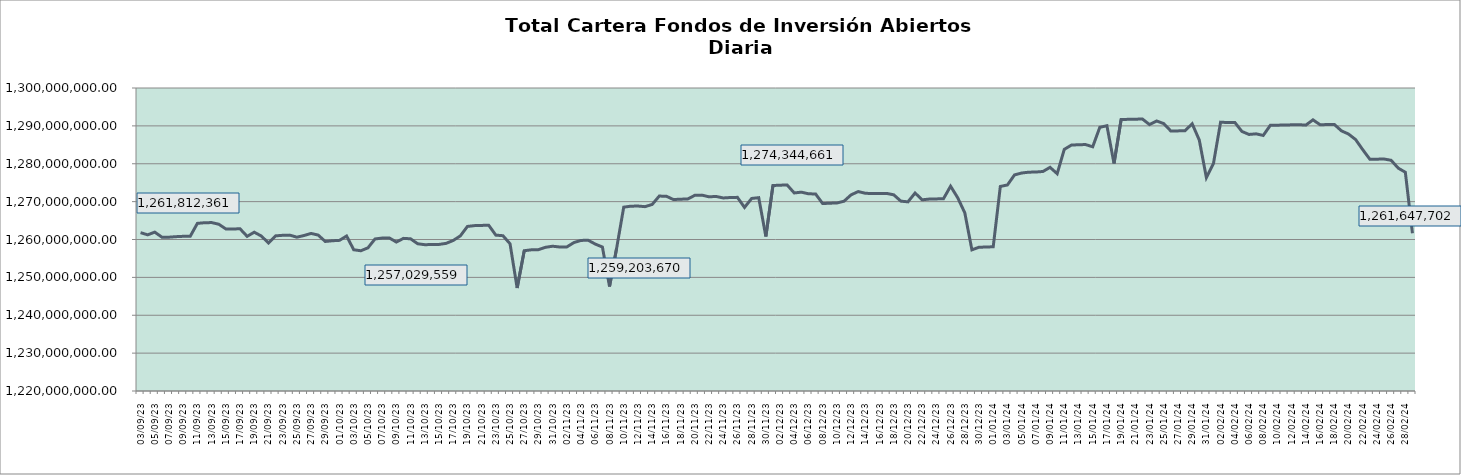
| Category | Cartera |
|---|---|
| 2023-09-03 | 1261812361.078 |
| 2023-09-04 | 1261232176.304 |
| 2023-09-05 | 1261946632.71 |
| 2023-09-06 | 1260620047.07 |
| 2023-09-07 | 1260610290.071 |
| 2023-09-08 | 1260750120.456 |
| 2023-09-09 | 1260838059.302 |
| 2023-09-10 | 1260877946.25 |
| 2023-09-11 | 1264256565.222 |
| 2023-09-12 | 1264427746.041 |
| 2023-09-13 | 1264467143.886 |
| 2023-09-14 | 1264039135.928 |
| 2023-09-15 | 1262791515.257 |
| 2023-09-16 | 1262783481.827 |
| 2023-09-17 | 1262825677.316 |
| 2023-09-18 | 1260833700.144 |
| 2023-09-19 | 1261927649.388 |
| 2023-09-20 | 1260912715.638 |
| 2023-09-21 | 1259080878.318 |
| 2023-09-22 | 1260963147.981 |
| 2023-09-23 | 1261107724.507 |
| 2023-09-24 | 1261155641.447 |
| 2023-09-25 | 1260608471.59 |
| 2023-09-26 | 1261051471.734 |
| 2023-09-27 | 1261600019.329 |
| 2023-09-28 | 1261166867.833 |
| 2023-09-29 | 1259476986.833 |
| 2023-09-30 | 1259671995.353 |
| 2023-10-01 | 1259772428.971 |
| 2023-10-02 | 1260923203.905 |
| 2023-10-03 | 1257290256.434 |
| 2023-10-04 | 1257029558.911 |
| 2023-10-05 | 1257795449.294 |
| 2023-10-06 | 1260148935.03 |
| 2023-10-07 | 1260380211.881 |
| 2023-10-08 | 1260425906.821 |
| 2023-10-09 | 1259322650.908 |
| 2023-10-10 | 1260297215.263 |
| 2023-10-11 | 1260186761.938 |
| 2023-10-12 | 1258876620.674 |
| 2023-10-13 | 1258631002.24 |
| 2023-10-14 | 1258669531.487 |
| 2023-10-15 | 1258699456.974 |
| 2023-10-16 | 1258975984.338 |
| 2023-10-17 | 1259744631.711 |
| 2023-10-18 | 1260943400.74 |
| 2023-10-19 | 1263448903.436 |
| 2023-10-20 | 1263662532.338 |
| 2023-10-21 | 1263721461.891 |
| 2023-10-22 | 1263762049.179 |
| 2023-10-23 | 1261151535.588 |
| 2023-10-24 | 1261002949.909 |
| 2023-10-25 | 1258872627.279 |
| 2023-10-26 | 1247187313.598 |
| 2023-10-27 | 1257040585.763 |
| 2023-10-28 | 1257273791.755 |
| 2023-10-29 | 1257319028.145 |
| 2023-10-30 | 1257946117.253 |
| 2023-10-31 | 1258223363.541 |
| 2023-11-01 | 1258017828.933 |
| 2023-11-02 | 1258049122.6 |
| 2023-11-03 | 1259203669.569 |
| 2023-11-04 | 1259759213.932 |
| 2023-11-05 | 1259800659.948 |
| 2023-11-06 | 1258789891.75 |
| 2023-11-07 | 1258010486.031 |
| 2023-11-08 | 1247587212.332 |
| 2023-11-09 | 1257694479.281 |
| 2023-11-10 | 1268542082.24 |
| 2023-11-11 | 1268794606.605 |
| 2023-11-12 | 1268833431.853 |
| 2023-11-13 | 1268671207.709 |
| 2023-11-14 | 1269250031.938 |
| 2023-11-15 | 1271461990.263 |
| 2023-11-16 | 1271424192.688 |
| 2023-11-17 | 1270544755.302 |
| 2023-11-18 | 1270648553.501 |
| 2023-11-19 | 1270689092.413 |
| 2023-11-20 | 1271660859.616 |
| 2023-11-21 | 1271717383.833 |
| 2023-11-22 | 1271272649.185 |
| 2023-11-23 | 1271367377.586 |
| 2023-11-24 | 1270970135.05 |
| 2023-11-25 | 1271085864.782 |
| 2023-11-26 | 1271126685.753 |
| 2023-11-27 | 1268466256.517 |
| 2023-11-28 | 1270834459.697 |
| 2023-11-29 | 1271045379.849 |
| 2023-11-30 | 1260799553.189 |
| 2023-12-01 | 1274248750.882 |
| 2023-12-02 | 1274344660.901 |
| 2023-12-03 | 1274387925.065 |
| 2023-12-04 | 1272287340.957 |
| 2023-12-05 | 1272503351.647 |
| 2023-12-06 | 1272065800.355 |
| 2023-12-07 | 1272023192.696 |
| 2023-12-08 | 1269482296.931 |
| 2023-12-09 | 1269587818.147 |
| 2023-12-10 | 1269639792.524 |
| 2023-12-11 | 1270110217.592 |
| 2023-12-12 | 1271793078.704 |
| 2023-12-13 | 1272654743.669 |
| 2023-12-14 | 1272210736.56 |
| 2023-12-15 | 1272116694.373 |
| 2023-12-16 | 1272123808.976 |
| 2023-12-17 | 1272169267.856 |
| 2023-12-18 | 1271797305.827 |
| 2023-12-19 | 1270131747.698 |
| 2023-12-20 | 1269939507.146 |
| 2023-12-21 | 1272272155.585 |
| 2023-12-22 | 1270482639.793 |
| 2023-12-23 | 1270677376.713 |
| 2023-12-24 | 1270718120.527 |
| 2023-12-25 | 1270763904.614 |
| 2023-12-26 | 1274071181.596 |
| 2023-12-27 | 1271027264.351 |
| 2023-12-28 | 1267048361.976 |
| 2023-12-29 | 1257267626.179 |
| 2023-12-30 | 1257960287.368 |
| 2023-12-31 | 1258007858.889 |
| 2024-01-01 | 1258085967.372 |
| 2024-01-02 | 1274003084.586 |
| 2024-01-03 | 1274399363.707 |
| 2024-01-04 | 1277057020.176 |
| 2024-01-05 | 1277554181.698 |
| 2024-01-06 | 1277772875.642 |
| 2024-01-07 | 1277817447.886 |
| 2024-01-08 | 1277960683.385 |
| 2024-01-09 | 1279052232.262 |
| 2024-01-10 | 1277370060.651 |
| 2024-01-11 | 1283800586.113 |
| 2024-01-12 | 1284921411.424 |
| 2024-01-13 | 1285024268.06 |
| 2024-01-14 | 1285066467.948 |
| 2024-01-15 | 1284476987.915 |
| 2024-01-16 | 1289621059.226 |
| 2024-01-17 | 1290039832.6 |
| 2024-01-18 | 1280074573.271 |
| 2024-01-19 | 1291669514.374 |
| 2024-01-20 | 1291727307.123 |
| 2024-01-21 | 1291768606.136 |
| 2024-01-22 | 1291805729.37 |
| 2024-01-23 | 1290341947.09 |
| 2024-01-24 | 1291293112.824 |
| 2024-01-25 | 1290598043.669 |
| 2024-01-26 | 1288637537.091 |
| 2024-01-27 | 1288676584.358 |
| 2024-01-28 | 1288715396.186 |
| 2024-01-29 | 1290560030.215 |
| 2024-01-30 | 1286264851.83 |
| 2024-01-31 | 1276321884.208 |
| 2024-02-01 | 1280110990.768 |
| 2024-02-02 | 1290977442.531 |
| 2024-02-03 | 1290872618.135 |
| 2024-02-04 | 1290915414.692 |
| 2024-02-05 | 1288530572.668 |
| 2024-02-06 | 1287734493.552 |
| 2024-02-07 | 1287898082.044 |
| 2024-02-08 | 1287471100.906 |
| 2024-02-09 | 1290150648.152 |
| 2024-02-10 | 1290186118.017 |
| 2024-02-11 | 1290224936.268 |
| 2024-02-12 | 1290275392.398 |
| 2024-02-13 | 1290313639.014 |
| 2024-02-14 | 1290198430.859 |
| 2024-02-15 | 1291596158.274 |
| 2024-02-16 | 1290299396.384 |
| 2024-02-17 | 1290348564.059 |
| 2024-02-18 | 1290387452.636 |
| 2024-02-19 | 1288697361.49 |
| 2024-02-20 | 1287847338.213 |
| 2024-02-21 | 1286388560.306 |
| 2024-02-22 | 1283726697.038 |
| 2024-02-23 | 1281201839.833 |
| 2024-02-24 | 1281210829.667 |
| 2024-02-25 | 1281247965.283 |
| 2024-02-26 | 1280915448.841 |
| 2024-02-27 | 1278845693.278 |
| 2024-02-28 | 1277753698.471 |
| 2024-02-29 | 1261647701.544 |